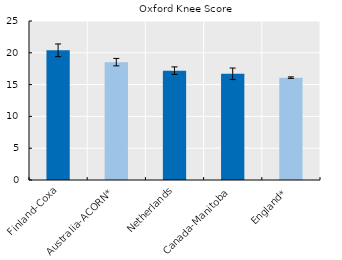
| Category | Series 0 |
|---|---|
| Finland-Coxa | 20.392 |
| Australia-ACORN* | 18.53 |
| Netherlands | 17.194 |
| Canada-Manitoba | 16.695 |
| England* | 16.094 |